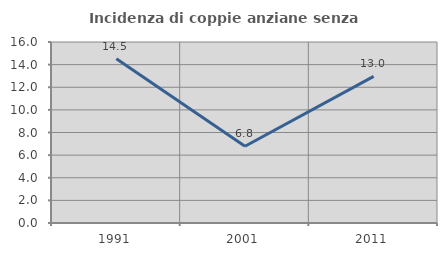
| Category | Incidenza di coppie anziane senza figli  |
|---|---|
| 1991.0 | 14.516 |
| 2001.0 | 6.78 |
| 2011.0 | 12.963 |